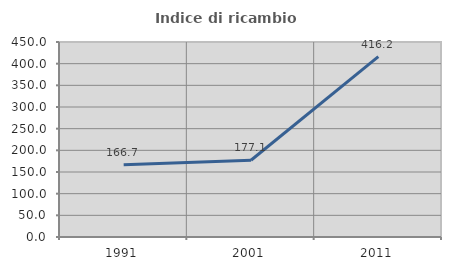
| Category | Indice di ricambio occupazionale  |
|---|---|
| 1991.0 | 166.667 |
| 2001.0 | 177.064 |
| 2011.0 | 416.176 |